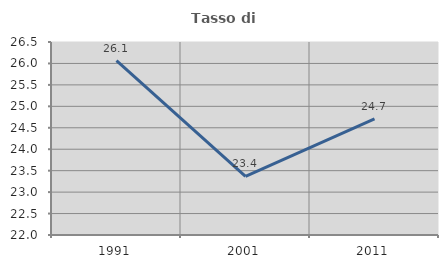
| Category | Tasso di occupazione   |
|---|---|
| 1991.0 | 26.064 |
| 2001.0 | 23.37 |
| 2011.0 | 24.706 |